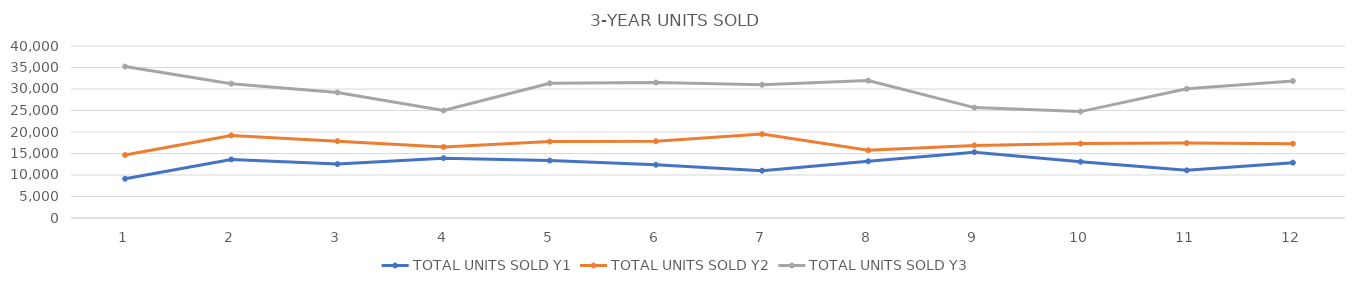
| Category | TOTAL UNITS SOLD Y1 | TOTAL UNITS SOLD Y2 | TOTAL UNITS SOLD Y3 |
|---|---|---|---|
| 0 | 9129 | 14647 | 35215 |
| 1 | 13628 | 19204 | 31243 |
| 2 | 12539 | 17864 | 29198 |
| 3 | 13910 | 16530 | 24992 |
| 4 | 13356 | 17775 | 31314 |
| 5 | 12381 | 17858 | 31508 |
| 6 | 11005 | 19508 | 30973 |
| 7 | 13184 | 15750 | 31959 |
| 8 | 15306 | 16882 | 25671 |
| 9 | 13088 | 17301 | 24743 |
| 10 | 11079 | 17423 | 30043 |
| 11 | 12870 | 17275 | 31855 |